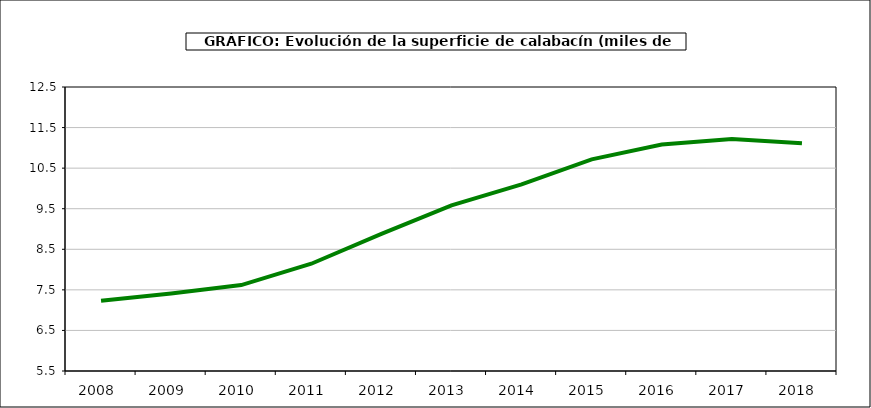
| Category | superficie |
|---|---|
| 2008.0 | 7.229 |
| 2009.0 | 7.41 |
| 2010.0 | 7.618 |
| 2011.0 | 8.144 |
| 2012.0 | 8.879 |
| 2013.0 | 9.582 |
| 2014.0 | 10.102 |
| 2015.0 | 10.717 |
| 2016.0 | 11.081 |
| 2017.0 | 11.218 |
| 2018.0 | 11.112 |